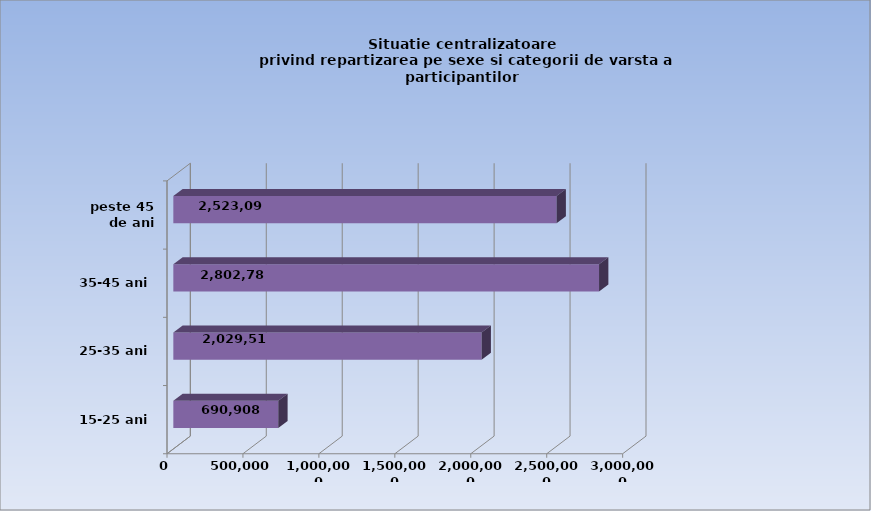
| Category | 15-25 ani 25-35 ani 35-45 ani peste 45 de ani |
|---|---|
| 15-25 ani | 690908 |
| 25-35 ani | 2029512 |
| 35-45 ani | 2802789 |
| peste 45 de ani | 2523096 |